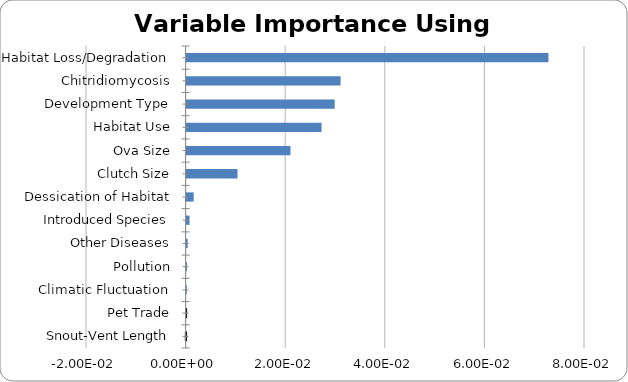
| Category | Series 0 |
|---|---|
| Habitat Loss/Degradation | 0.073 |
| Chitridiomycosis | 0.031 |
| Development Type | 0.03 |
| Habitat Use | 0.027 |
| Ova Size | 0.021 |
| Clutch Size | 0.01 |
| Dessication of Habitat | 0.001 |
| Introduced Species | 0.001 |
| Other Diseases | 0 |
| Pollution | 0 |
| Climatic Fluctuation | 0 |
| Pet Trade | 0 |
| Snout-Vent Length | 0 |